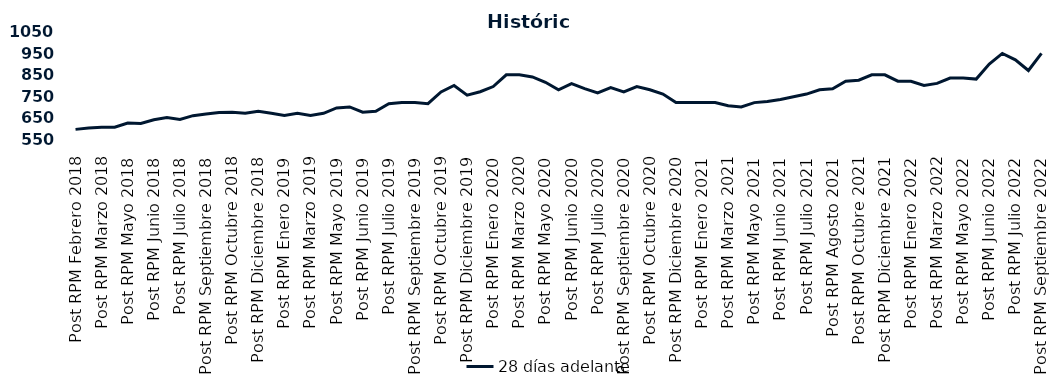
| Category | 28 días adelante |
|---|---|
| Post RPM Febrero 2018 | 595 |
| Pre RPM Marzo 2018 | 601 |
| Post RPM Marzo 2018 | 605 |
| Pre RPM Mayo 2018 | 605 |
| Post RPM Mayo 2018 | 625 |
| Pre RPM Junio 2018 | 623 |
| Post RPM Junio 2018 | 640 |
| Pre RPM Julio 2018 | 650 |
| Post RPM Julio 2018 | 641 |
| Pre RPM Septiembre 2018 | 659 |
| Post RPM Septiembre 2018 | 666.75 |
| Pre RPM Octubre 2018 | 674 |
| Post RPM Octubre 2018 | 675 |
| Pre RPM Diciembre 2018 | 670 |
| Post RPM Diciembre 2018 | 680 |
| Pre RPM Enero 2019 | 670 |
| Post RPM Enero 2019 | 660 |
| Pre RPM Marzo 2019 | 670 |
| Post RPM Marzo 2019 | 660 |
| Pre RPM Mayo 2019 | 670 |
| Post RPM Mayo 2019 | 695 |
| Pre RPM Junio 2019 | 700 |
| Post RPM Junio 2019 | 675 |
| Pre RPM Julio 2019 | 680 |
| Post RPM Julio 2019 | 715 |
| Pre RPM Septiembre 2019 | 720 |
| Post RPM Septiembre 2019 | 720 |
| Pre RPM Octubre 2019 | 715 |
| Post RPM Octubre 2019 | 770 |
| Pre RPM Diciembre 2019 | 800 |
| Post RPM Diciembre 2019 | 755 |
| Pre RPM Enero 2020 | 771 |
| Post RPM Enero 2020 | 795 |
| Pre RPM Marzo 2020 | 850 |
| Post RPM Marzo 2020 | 850 |
| Pre RPM Mayo 2020 | 840 |
| Post RPM Mayo 2020 | 815 |
| Pre RPM Junio 2020 | 780 |
| Post RPM Junio 2020 | 809 |
| Pre RPM Julio 2020 | 785.72 |
| Post RPM Julio 2020 | 765 |
| Pre RPM Septiembre 2020 | 790 |
| Post RPM Septiembre 2020 | 770 |
| Pre RPM Octubre 2020 | 795 |
| Post RPM Octubre 2020 | 780 |
| Pre RPM Diciembre 2020 | 760 |
| Post RPM Diciembre 2020 | 720 |
| Pre RPM Enero 2021 | 720 |
| Post RPM Enero 2021 | 720 |
| Pre RPM Marzo 2021 | 720 |
| Post RPM Marzo 2021 | 705 |
| Pre RPM Mayo 2021 | 700 |
| Post RPM Mayo 2021 | 720 |
| Pre RPM Junio 2021 | 725 |
| Post RPM Junio 2021 | 735 |
| Pre RPM Julio 2021 | 747.5 |
| Post RPM Julio 2021 | 760 |
| Pre RPM Agosto 2021 | 780 |
| Post RPM Agosto 2021 | 785 |
| Pre RPM Octubre 2021 | 820 |
| Post RPM Octubre 2021 | 825 |
| Pre RPM Diciembre 2021 | 850 |
| Post RPM Diciembre 2021 | 850 |
| Pre RPM Enero 2022 | 820 |
| Post RPM Enero 2022 | 820 |
| Pre RPM Marzo 2022 | 800 |
| Post RPM Marzo 2022 | 810 |
| Pre RPM Mayo 2022 | 835 |
| Post RPM Mayo 2022 | 835 |
| Pre RPM Junio 2022 | 830 |
| Post RPM Junio 2022 | 900 |
| Pre RPM Julio 2022 | 950 |
| Post RPM Julio 2022 | 920 |
| Pre RPM Septiembre 2022 | 870 |
| Post RPM Septiembre 2022 | 950 |